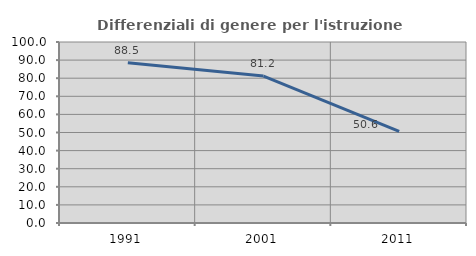
| Category | Differenziali di genere per l'istruzione superiore |
|---|---|
| 1991.0 | 88.492 |
| 2001.0 | 81.169 |
| 2011.0 | 50.615 |